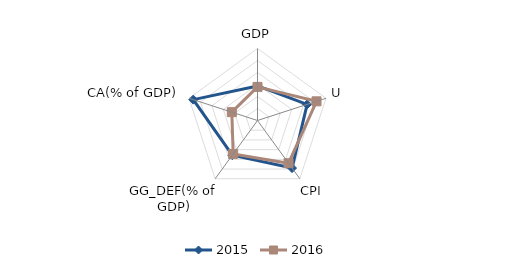
| Category | 2015 | 2016 |
|---|---|---|
| GDP | 2.88 | 2.8 |
| U | 4.348 | 5.172 |
| CPI | 4.9 | 4.4 |
| GG_DEF(% of GDP) | 3.571 | 3.448 |
| CA(% of GDP) | 5.625 | 2.25 |